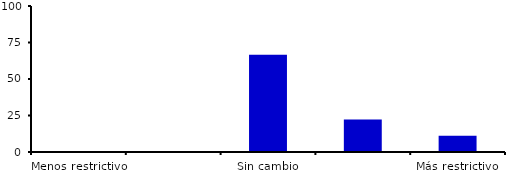
| Category | Series 0 |
|---|---|
| Menos restrictivo | 0 |
| Moderadamente menos restrictivo | 0 |
| Sin cambio | 66.667 |
| Moderadamente más restrictivo | 22.222 |
| Más restrictivo | 11.111 |